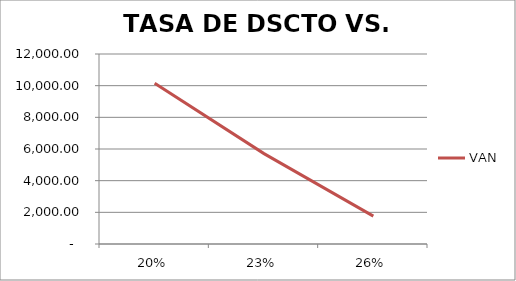
| Category | VAN |
|---|---|
| 0.2 | 10154.961 |
| 0.23 | 5709.332 |
| 0.26 | 1762.122 |